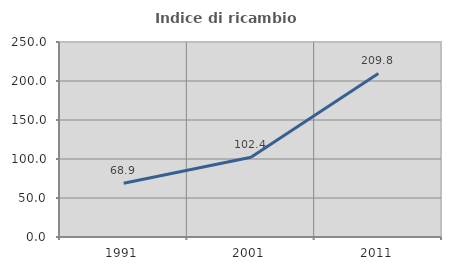
| Category | Indice di ricambio occupazionale  |
|---|---|
| 1991.0 | 68.861 |
| 2001.0 | 102.361 |
| 2011.0 | 209.756 |